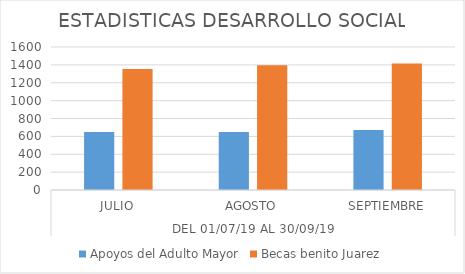
| Category | Apoyos del Adulto Mayor | Becas benito Juarez |
|---|---|---|
| 0 | 650 | 1355 |
| 1 | 650 | 1397 |
| 2 | 670 | 1415 |